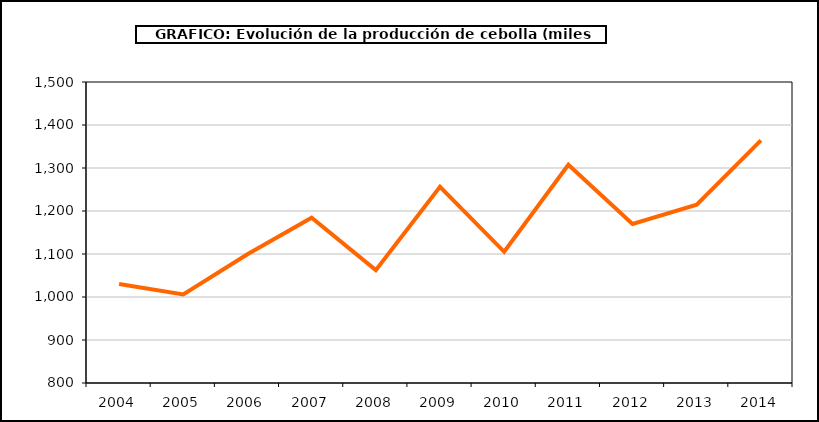
| Category | producción |
|---|---|
| 2004.0 | 1030.449 |
| 2005.0 | 1006.051 |
| 2006.0 | 1099.551 |
| 2007.0 | 1184.25 |
| 2008.0 | 1062.537 |
| 2009.0 | 1256.288 |
| 2010.0 | 1105.131 |
| 2011.0 | 1307.531 |
| 2012.0 | 1169.721 |
| 2013.0 | 1214.501 |
| 2014.0 | 1364.117 |